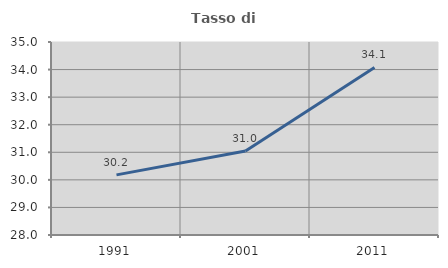
| Category | Tasso di occupazione   |
|---|---|
| 1991.0 | 30.181 |
| 2001.0 | 31.046 |
| 2011.0 | 34.079 |